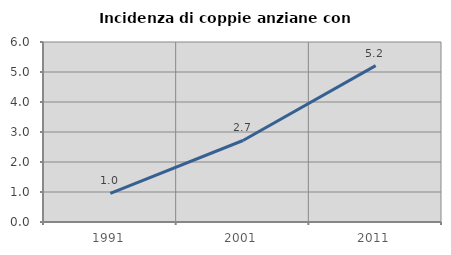
| Category | Incidenza di coppie anziane con figli |
|---|---|
| 1991.0 | 0.952 |
| 2001.0 | 2.717 |
| 2011.0 | 5.214 |